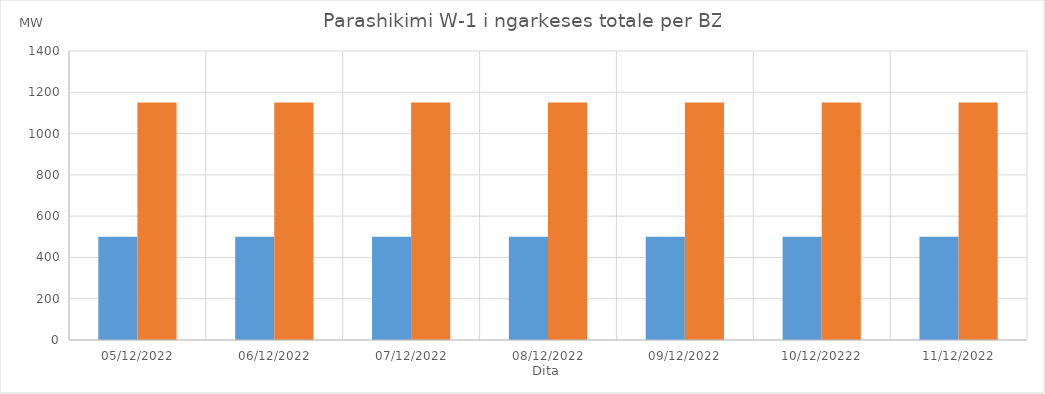
| Category | Min (MW) | Max (MW) |
|---|---|---|
| 05/12/2022 | 500 | 1150 |
| 06/12/2022 | 500 | 1150 |
| 07/12/2022 | 500 | 1150 |
| 08/12/2022 | 500 | 1150 |
| 09/12/2022 | 500 | 1150 |
| 10/12/20222 | 500 | 1150 |
| 11/12/2022 | 500 | 1150 |